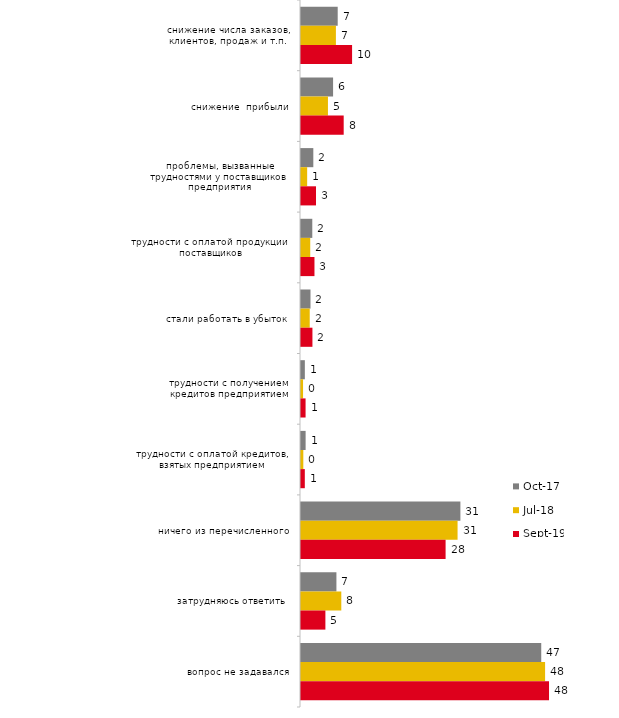
| Category | окт.17 | июл.18 | сен.19 |
|---|---|---|---|
| снижение числа заказов, клиентов, продаж и т.п. | 7.15 | 6.8 | 9.95 |
| снижение  прибыли | 6.25 | 5.25 | 8.317 |
| проблемы, вызванные трудностями у поставщиков предприятия | 2.4 | 1.2 | 2.921 |
| трудности с оплатой продукции поставщиков | 2.2 | 1.8 | 2.624 |
| стали работать в убыток | 1.85 | 1.7 | 2.228 |
| трудности с получением кредитов предприятием | 0.75 | 0.4 | 0.891 |
| трудности с оплатой кредитов, взятых предприятием | 0.9 | 0.45 | 0.743 |
| ничего из перечисленного | 31.05 | 30.5 | 28.168 |
| затрудняюсь ответить | 6.9 | 7.85 | 4.752 |
| вопрос не задавался | 46.8 | 47.55 | 48.317 |